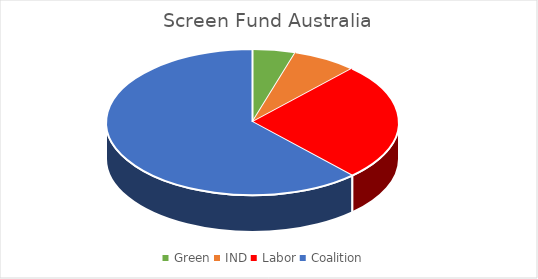
| Category | Series 0 |
|---|---|
| Green | 2 |
| IND | 3 |
| Labor | 11 |
| Coalition | 26 |